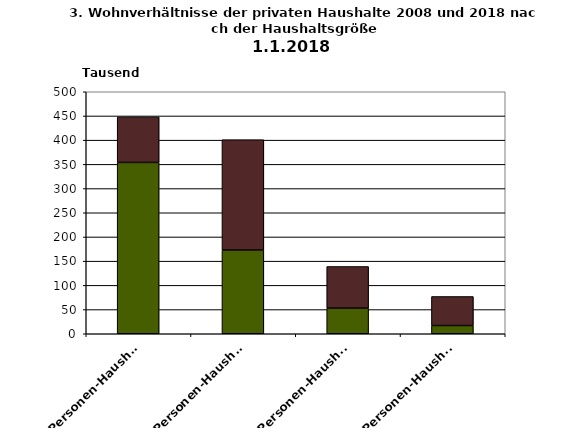
| Category | Haushalte als Mieter | Haushalte in Wohneigentum  |
|---|---|---|
| 1-Personen-Haushalte | 354 | 94 |
| 2-Personen-Haushalte | 173 | 228 |
| 3-Personen-Haushalte | 53 | 86 |
| 4-Personen-Haushalte | 17 | 60 |